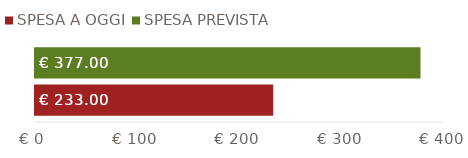
| Category | SPESA A OGGI | SPESA PREVISTA |
|---|---|---|
| TOTALI | 233 | 377 |